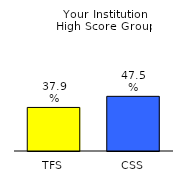
| Category | Series 0 |
|---|---|
| TFS | 0.379 |
| CSS | 0.475 |